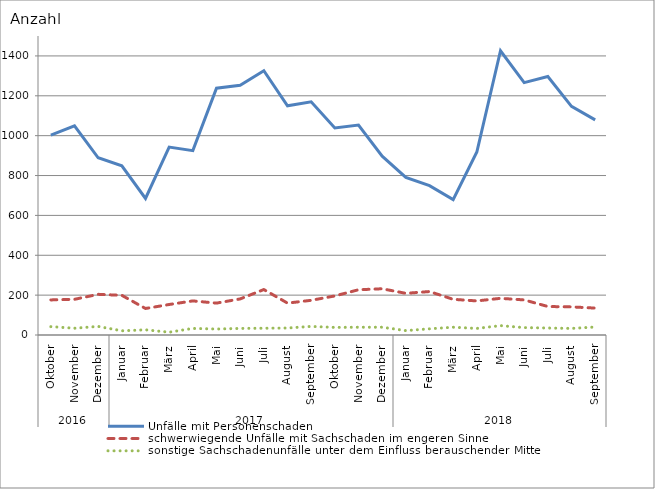
| Category | Unfälle mit Personenschaden | schwerwiegende Unfälle mit Sachschaden im engeren Sinne | sonstige Sachschadenunfälle unter dem Einfluss berauschender Mittel |
|---|---|---|---|
| 0 | 1003 | 176 | 42 |
| 1 | 1049 | 179 | 34 |
| 2 | 889 | 204 | 43 |
| 3 | 849 | 199 | 21 |
| 4 | 685 | 133 | 26 |
| 5 | 943 | 153 | 14 |
| 6 | 925 | 171 | 33 |
| 7 | 1238 | 160 | 30 |
| 8 | 1253 | 181 | 33 |
| 9 | 1326 | 228 | 34 |
| 10 | 1150 | 160 | 35 |
| 11 | 1170 | 174 | 43 |
| 12 | 1039 | 196 | 38 |
| 13 | 1053 | 227 | 39 |
| 14 | 897 | 232 | 39 |
| 15 | 791 | 209 | 22 |
| 16 | 749 | 218 | 31 |
| 17 | 679 | 179 | 39 |
| 18 | 918 | 171 | 33 |
| 19 | 1426 | 184 | 47 |
| 20 | 1266 | 176 | 37 |
| 21 | 1297 | 143 | 35 |
| 22 | 1147 | 141 | 33 |
| 23 | 1079 | 135 | 40 |